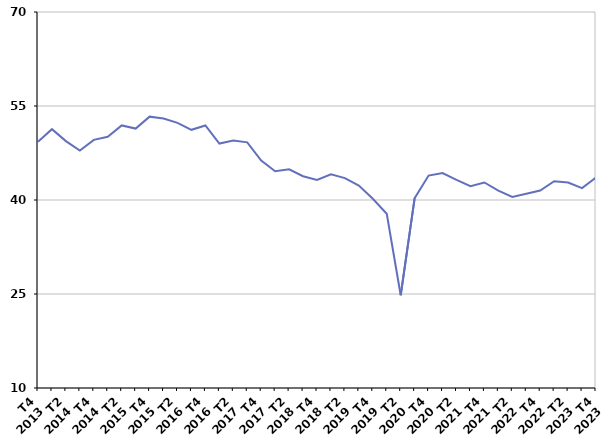
| Category | Autre cas |
|---|---|
| T4
2013 | 49.3 |
| T1
2014 | 51.3 |
| T2
2014 | 49.4 |
| T3
2014 | 47.9 |
| T4
2014 | 49.6 |
| T1
2015 | 50.1 |
| T2
2015 | 51.9 |
| T3
2015 | 51.4 |
| T4
2015 | 53.3 |
| T1
2016 | 53 |
| T2
2016 | 52.3 |
| T3
2016 | 51.2 |
| T4
2016 | 51.9 |
| T1
2017 | 49 |
| T2
2017 | 49.5 |
| T3
2017 | 49.2 |
| T4
2017 | 46.3 |
| T1
2018 | 44.6 |
| T2
2018 | 44.9 |
| T3
2018 | 43.8 |
| T4
2018 | 43.2 |
| T1
2019 | 44.1 |
| T2
2019 | 43.5 |
| T3
2019 | 42.3 |
| T4
2019 | 40.2 |
| T1
2020 | 37.8 |
| T2
2020 | 24.8 |
| T3
2020 | 40.3 |
| T4
2020 | 43.9 |
| T1
2021 | 44.3 |
| T2
2021 | 43.2 |
| T3
2021 | 42.2 |
| T4
2021 | 42.8 |
| T1
2022 | 41.5 |
| T2
2022 | 40.5 |
| T3
2022 | 41 |
| T4
2022 | 41.5 |
| T1
2023 | 43 |
| T2
2023 | 42.8 |
| T3
2023 | 41.9 |
| T4
2023 | 43.6 |